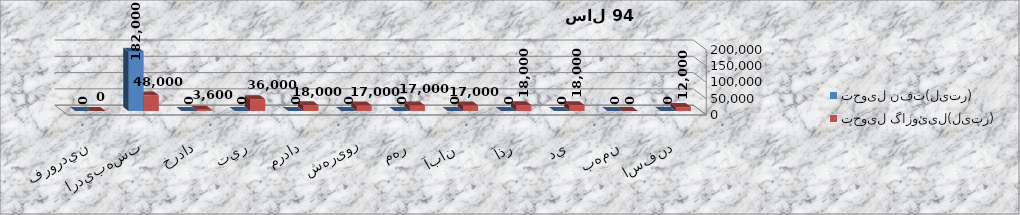
| Category | تحویل نفت(لیتر) | تحویل گازوئیل(لیتر) |
|---|---|---|
| اسفند | 0 | 12000 |
| بهمن | 0 | 0 |
| دي | 0 | 18000 |
| آذر | 0 | 18000 |
| آبان  | 0 | 17000 |
| مهر | 0 | 17000 |
| شهریور | 0 | 17000 |
| مرداد | 0 | 18000 |
| تير | 0 | 36000 |
| خرداد | 0 | 3600 |
| ارديبهشت | 182000 | 48000 |
| فروردين | 0 | 0 |